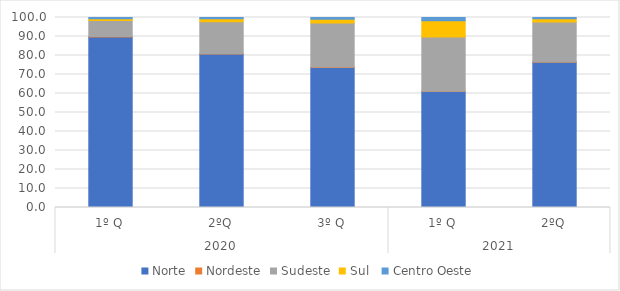
| Category | Norte | Nordeste | Sudeste | Sul  | Centro Oeste |
|---|---|---|---|---|---|
| 0 | 89.758 | 0.208 | 8.463 | 0.868 | 0.703 |
| 1 | 80.844 | 0.106 | 16.834 | 1.583 | 0.633 |
| 2 | 73.725 | 0.253 | 23.117 | 1.974 | 0.932 |
| 3 | 61.038 | 0.211 | 28.425 | 8.562 | 1.765 |
| 4 | 76.429 | 0.157 | 21.06 | 1.753 | 0.602 |